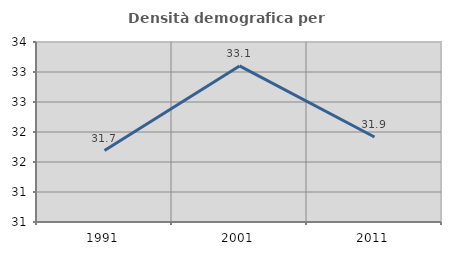
| Category | Densità demografica |
|---|---|
| 1991.0 | 31.691 |
| 2001.0 | 33.101 |
| 2011.0 | 31.917 |